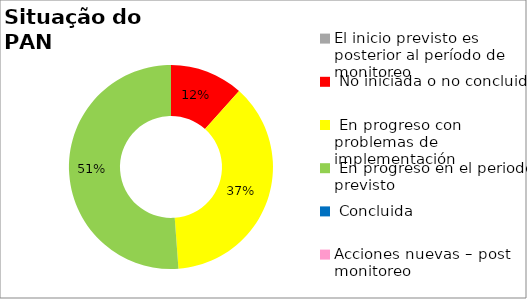
| Category | Series 0 |
|---|---|
| El inicio previsto es posterior al período de monitoreo | 0 |
|  No iniciada o no concluida | 0.116 |
|  En progreso con problemas de implementación | 0.372 |
|  En progreso en el periodo previsto | 0.512 |
|  Concluida | 0 |
| Acciones nuevas – post monitoreo | 0 |